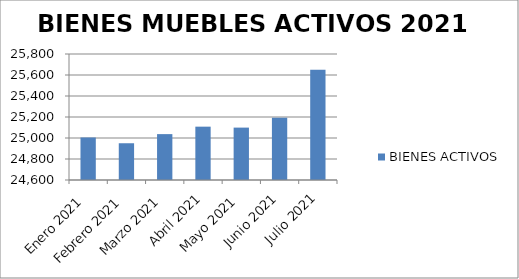
| Category | BIENES ACTIVOS |
|---|---|
| Enero 2021 | 25005 |
| Febrero 2021 | 24950 |
| Marzo 2021 | 25037 |
| Abril 2021 | 25108 |
| Mayo 2021 | 25099 |
| Junio 2021 | 25193 |
| Julio 2021 | 25650 |